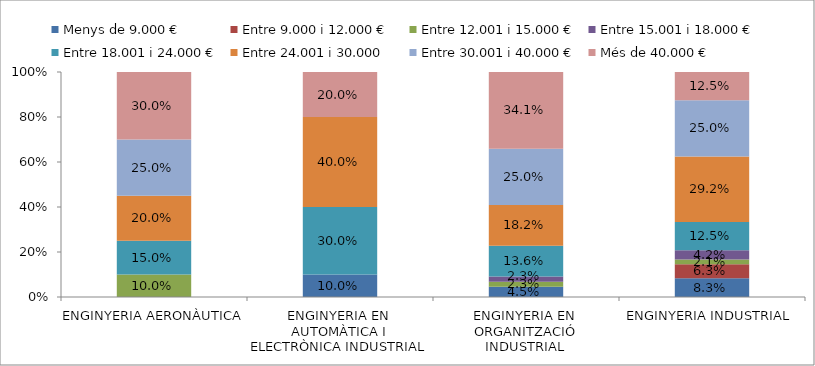
| Category | Menys de 9.000 € | Entre 9.000 i 12.000 € | Entre 12.001 i 15.000 € | Entre 15.001 i 18.000 € | Entre 18.001 i 24.000 € | Entre 24.001 i 30.000 | Entre 30.001 i 40.000 € | Més de 40.000 € |
|---|---|---|---|---|---|---|---|---|
| ENGINYERIA AERONÀUTICA | 0 | 0 | 0.1 | 0 | 0.15 | 0.2 | 0.25 | 0.3 |
| ENGINYERIA EN AUTOMÀTICA I ELECTRÒNICA INDUSTRIAL | 0.1 | 0 | 0 | 0 | 0.3 | 0.4 | 0 | 0.2 |
| ENGINYERIA EN ORGANITZACIÓ INDUSTRIAL | 0.045 | 0 | 0.023 | 0.023 | 0.136 | 0.182 | 0.25 | 0.341 |
| ENGINYERIA INDUSTRIAL | 0.083 | 0.062 | 0.021 | 0.042 | 0.125 | 0.292 | 0.25 | 0.125 |